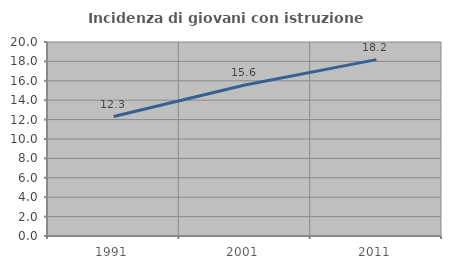
| Category | Incidenza di giovani con istruzione universitaria |
|---|---|
| 1991.0 | 12.319 |
| 2001.0 | 15.574 |
| 2011.0 | 18.182 |